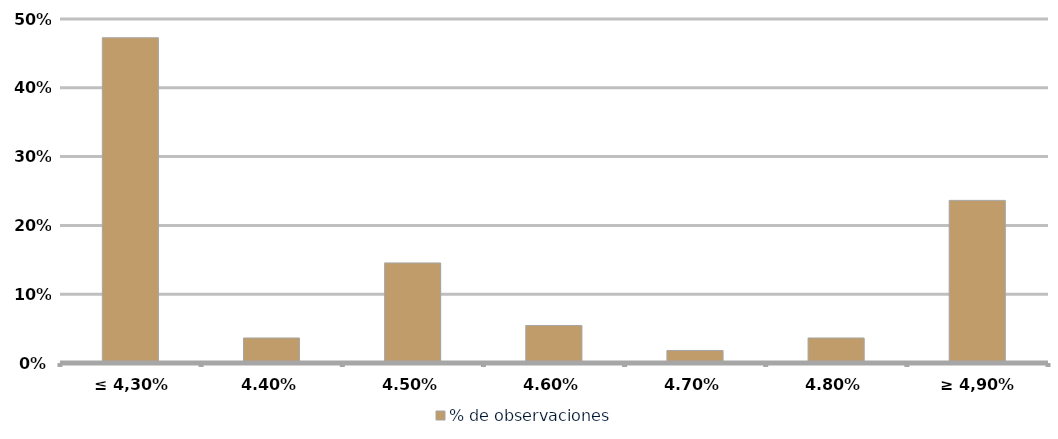
| Category | % de observaciones  |
|---|---|
| ≤ 4,30% | 0.473 |
| 4,40% | 0.036 |
| 4,50% | 0.145 |
| 4,60% | 0.055 |
| 4,70% | 0.018 |
| 4,80% | 0.036 |
| ≥ 4,90% | 0.236 |